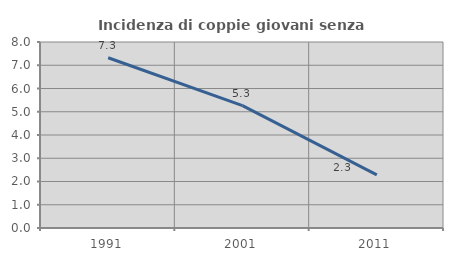
| Category | Incidenza di coppie giovani senza figli |
|---|---|
| 1991.0 | 7.323 |
| 2001.0 | 5.263 |
| 2011.0 | 2.287 |